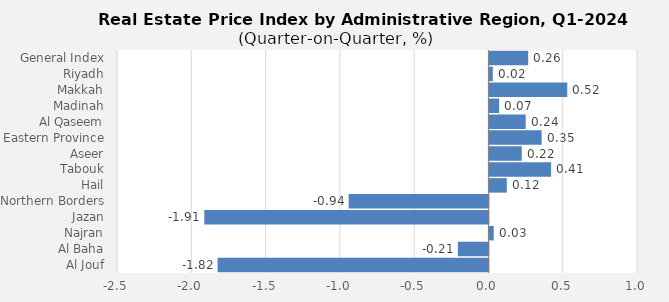
| Category | 2024 |
|---|---|
| General Index | 0.261 |
| Riyadh | 0.023 |
| Makkah | 0.524 |
| Madinah | 0.065 |
| Al Qaseem | 0.244 |
| Eastern Province | 0.351 |
| Aseer | 0.217 |
| Tabouk | 0.415 |
| Hail | 0.117 |
| Northern Borders | -0.941 |
| Jazan | -1.912 |
| Najran | 0.029 |
| Al Baha | -0.206 |
| Al Jouf | -1.823 |